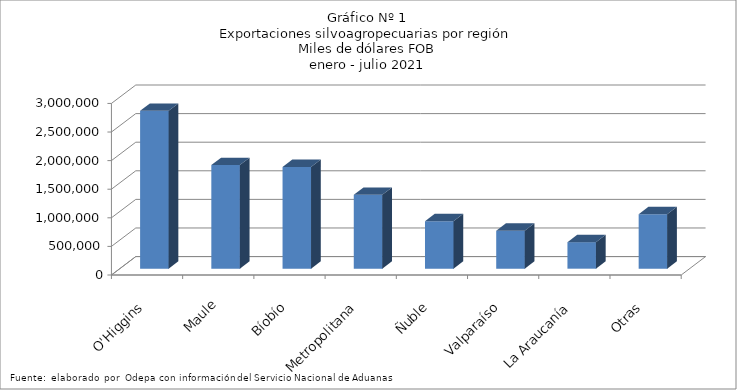
| Category | Series 0 |
|---|---|
| O'Higgins | 2761552.525 |
| Maule | 1811077.678 |
| Bíobío | 1778432.845 |
| Metropolitana | 1292086.731 |
| Ñuble | 831420.372 |
| Valparaíso | 663953.095 |
| La Araucanía | 463855.347 |
| Otras | 952398.108 |